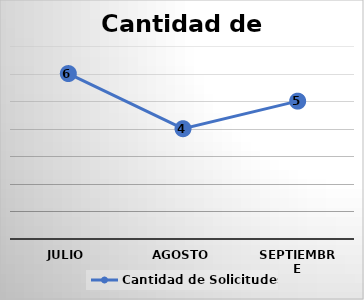
| Category | Cantidad de Solicitudes  |
|---|---|
| Julio | 6 |
| Agosto | 4 |
| Septiembre | 5 |